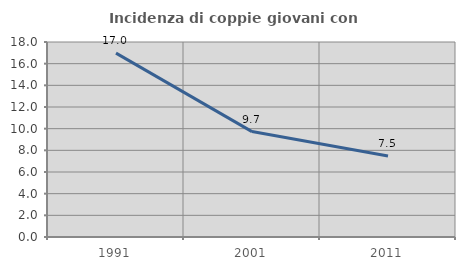
| Category | Incidenza di coppie giovani con figli |
|---|---|
| 1991.0 | 16.969 |
| 2001.0 | 9.731 |
| 2011.0 | 7.469 |